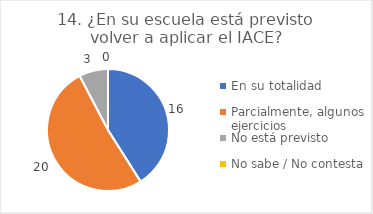
| Category | 14. ¿En su escuela está previsto volver a aplicar el IACE? |
|---|---|
| En su totalidad  | 0.41 |
| Parcialmente, algunos ejercicios  | 0.513 |
| No está previsto  | 0.077 |
| No sabe / No contesta | 0 |